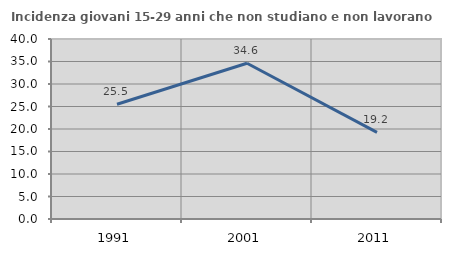
| Category | Incidenza giovani 15-29 anni che non studiano e non lavorano  |
|---|---|
| 1991.0 | 25.504 |
| 2001.0 | 34.615 |
| 2011.0 | 19.247 |